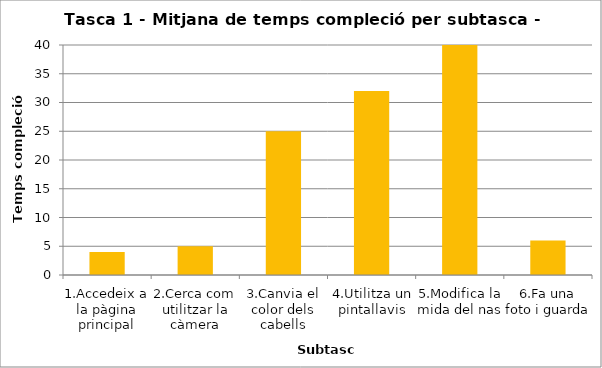
| Category | Series 0 |
|---|---|
| 1.Accedeix a la pàgina principal | 4 |
| 2.Cerca com utilitzar la càmera | 5 |
| 3.Canvia el color dels cabells | 25 |
| 4.Utilitza un pintallavis | 32 |
| 5.Modifica la mida del nas | 41 |
| 6.Fa una foto i guarda | 6 |